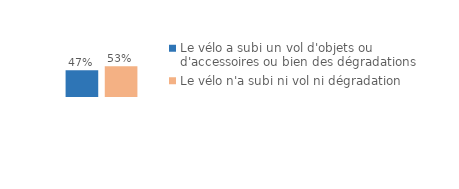
| Category | Le vélo a subi un vol d'objets ou d'accessoires ou bien des dégradations | Le vélo n'a subi ni vol ni dégradation |
|---|---|---|
| 0 | 0.466 | 0.534 |